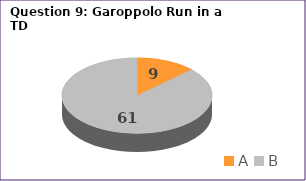
| Category | Series 0 |
|---|---|
| A | 9 |
| B | 61 |